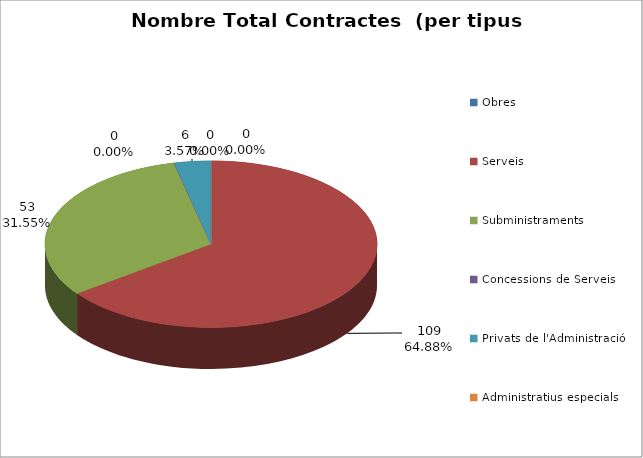
| Category | Nombre Total Contractes |
|---|---|
| Obres | 0 |
| Serveis | 109 |
| Subministraments | 53 |
| Concessions de Serveis | 0 |
| Privats de l'Administració | 6 |
| Administratius especials | 0 |